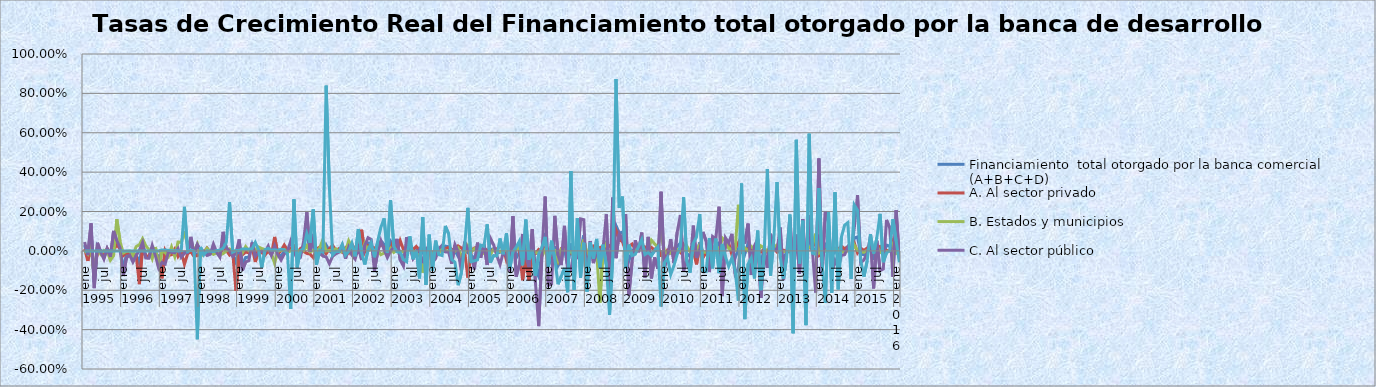
| Category | Financiamiento  total otorgado por la banca comercial (A+B+C+D)  | A. Al sector privado  | B. Estados y municipios  | C. Al sector público  | D. Otros  |
|---|---|---|---|---|---|
| 0 | 0.029 | 0.01 | 0.003 | 0.045 | 0 |
| 1 | -0.033 | -0.051 | -0.016 | -0.022 | 0 |
| 2 | 0.092 | 0.028 | 0.031 | 0.14 | 0 |
| 3 | -0.159 | -0.112 | -0.131 | -0.189 | 0 |
| 4 | 0.024 | -0.002 | 0.022 | 0.041 | 0 |
| 5 | -0.004 | 0.001 | -0.016 | -0.006 | 0 |
| 6 | -0.034 | -0.025 | 0.002 | -0.042 | 0 |
| 7 | 0.011 | 0.013 | -0.002 | 0.011 | 0 |
| 8 | -0.024 | -0.011 | -0.047 | -0.031 | 0 |
| 9 | 0.059 | 0.003 | -0.024 | 0.101 | 0 |
| 10 | 0.05 | 0.032 | 0.162 | 0.053 | 0 |
| 11 | 0.015 | 0.01 | 0.048 | 0.016 | 0 |
| 12 | -0.086 | -0.024 | -0.011 | -0.128 | 0 |
| 13 | -0.024 | -0.01 | -0.002 | -0.035 | 0 |
| 14 | -0.018 | -0.015 | -0.001 | -0.022 | 0 |
| 15 | -0.043 | -0.024 | -0.024 | -0.057 | 0 |
| 16 | -0.02 | -0.02 | 0.022 | -0.024 | 0 |
| 17 | -0.062 | -0.169 | 0.031 | 0.003 | 0 |
| 18 | 0.035 | 0.016 | 0.062 | 0.043 | 0 |
| 19 | -0.03 | -0.028 | 0.026 | -0.037 | 0 |
| 20 | -0.03 | -0.024 | 0.005 | -0.037 | 0 |
| 21 | 0.02 | 0.018 | -0.039 | 0.027 | 0 |
| 22 | -0.017 | -0.007 | 0.019 | -0.026 | 0 |
| 23 | -0.026 | -0.051 | -0.087 | -0.088 | 0 |
| 24 | -0.079 | -0.139 | -0.002 | -0.059 | 0.005 |
| 25 | -0.037 | 0.004 | -0.008 | -0.067 | 0.005 |
| 26 | -0.013 | -0.023 | -0.028 | -0.007 | 0.003 |
| 27 | -0.009 | -0.02 | 0.02 | -0.008 | 0.001 |
| 28 | -0.004 | 0.009 | -0.028 | -0.01 | 0.001 |
| 29 | 0.001 | -0.029 | 0.045 | 0.013 | 0 |
| 30 | -0.017 | -0.005 | 0.044 | -0.032 | 0 |
| 31 | -0.007 | -0.068 | 0.099 | -0.012 | 0.224 |
| 32 | -0.007 | -0.014 | 0.031 | -0.009 | -0.003 |
| 33 | 0.042 | -0.005 | 0.053 | 0.071 | 0.004 |
| 34 | -0.02 | -0.029 | -0.002 | -0.02 | -0.001 |
| 35 | -0.018 | -0.024 | 0.035 | 0.033 | -0.449 |
| 36 | -0.004 | -0.016 | -0.032 | 0.004 | 0.019 |
| 37 | -0.005 | -0.009 | -0.008 | -0.001 | -0.02 |
| 38 | -0.009 | 0.015 | 0.013 | -0.023 | 0 |
| 39 | -0.013 | -0.006 | -0.006 | -0.018 | -0.001 |
| 40 | 0.014 | -0.014 | -0.018 | 0.035 | -0.004 |
| 41 | -0.007 | -0.005 | -0.009 | -0.008 | 0.002 |
| 42 | -0.026 | -0.021 | -0.021 | -0.032 | 0.004 |
| 43 | 0.062 | 0.019 | -0.014 | 0.097 | 0.013 |
| 44 | 0.012 | 0.004 | 0 | 0.015 | 0.043 |
| 45 | 0.006 | -0.022 | 0.01 | 0.001 | 0.248 |
| 46 | -0.02 | -0.01 | 0 | -0.029 | -0.007 |
| 47 | -0.06 | -0.203 | -0.001 | -0.012 | 0.002 |
| 48 | 0.034 | -0.024 | 0.023 | 0.059 | 0.001 |
| 49 | -0.069 | -0.02 | -0.01 | -0.099 | 0.01 |
| 50 | -0.034 | -0.006 | 0.022 | -0.056 | 0.01 |
| 51 | -0.032 | -0.01 | 0.001 | -0.05 | 0.008 |
| 52 | 0.031 | 0.018 | 0.008 | 0.043 | 0.011 |
| 53 | -0.026 | -0.057 | 0.007 | -0.027 | 0.043 |
| 54 | -0.003 | 0.007 | 0.02 | -0.012 | 0.006 |
| 55 | -0.007 | -0.009 | 0.012 | -0.002 | -0.085 |
| 56 | -0.008 | -0.022 | 0.007 | -0.007 | 0.006 |
| 57 | 0.016 | -0.001 | 0.008 | 0.024 | 0.013 |
| 58 | -0.019 | -0.021 | -0.012 | -0.022 | 0.004 |
| 59 | 0.024 | 0.071 | -0.063 | 0.025 | 0.005 |
| 60 | -0.015 | -0.016 | -0.001 | -0.02 | 0.003 |
| 61 | -0.027 | 0.001 | 0.002 | -0.047 | 0.008 |
| 62 | -0.001 | 0.03 | 0.007 | -0.016 | 0.005 |
| 63 | -0.001 | 0.004 | -0.007 | -0.001 | -0.013 |
| 64 | 0.012 | 0.013 | 0 | 0.05 | -0.295 |
| 65 | 0.018 | 0.024 | 0.004 | 0 | 0.262 |
| 66 | -0.033 | -0.01 | 0.005 | -0.043 | -0.084 |
| 67 | -0.018 | 0.011 | -0.007 | -0.034 | 0.001 |
| 68 | 0.027 | -0.003 | 0 | 0.047 | 0.012 |
| 69 | 0.121 | -0.013 | 0.026 | 0.196 | 0.088 |
| 70 | -0.005 | -0.016 | -0.005 | -0.004 | 0.041 |
| 71 | 0.059 | -0.034 | 0.002 | 0.086 | 0.211 |
| 72 | -0.028 | 0.008 | -0.003 | -0.039 | -0.071 |
| 73 | -0.003 | 0.02 | 0.015 | -0.013 | 0.003 |
| 74 | -0.012 | -0.004 | 0.058 | -0.027 | -0.006 |
| 75 | 0.03 | -0.015 | 0 | -0.031 | 0.839 |
| 76 | 0 | 0.011 | 0.002 | -0.064 | 0.324 |
| 77 | -0.012 | 0.029 | 0.003 | -0.028 | -0.021 |
| 78 | -0.007 | 0.002 | 0.011 | -0.015 | -0.002 |
| 79 | -0.002 | 0.012 | -0.003 | -0.007 | -0.003 |
| 80 | 0.019 | -0.006 | -0.005 | 0.029 | 0.033 |
| 81 | -0.022 | 0.015 | -0.005 | -0.04 | -0.022 |
| 82 | 0.013 | -0.009 | 0.052 | 0.018 | -0.001 |
| 83 | 0.004 | 0.035 | 0.019 | -0.022 | 0.039 |
| 84 | -0.026 | 0.004 | -0.006 | -0.042 | -0.027 |
| 85 | 0.025 | -0.006 | 0.015 | 0.015 | 0.111 |
| 86 | -0.003 | 0.107 | -0.008 | -0.047 | -0.009 |
| 87 | 0.005 | -0.006 | 0.039 | 0.028 | -0.069 |
| 88 | 0.041 | 0.027 | 0.004 | 0.067 | 0.004 |
| 89 | 0.04 | 0.016 | 0.007 | 0.058 | 0.042 |
| 90 | -0.054 | 0.016 | -0.002 | -0.101 | -0.032 |
| 91 | 0.007 | 0.011 | 0.003 | -0.006 | 0.048 |
| 92 | 0.051 | 0.034 | -0.019 | 0.052 | 0.12 |
| 93 | 0.033 | 0.017 | -0.011 | 0.007 | 0.165 |
| 94 | -0.014 | 0.017 | -0.005 | -0.034 | -0.009 |
| 95 | 0.05 | 0.001 | 0.014 | -0.001 | 0.258 |
| 96 | 0.027 | 0.059 | -0.008 | 0.019 | 0.024 |
| 97 | 0.024 | -0.006 | 0.003 | 0.061 | -0.005 |
| 98 | -0.011 | 0.052 | -0.005 | -0.047 | -0.007 |
| 99 | -0.042 | 0.006 | -0.005 | -0.077 | -0.044 |
| 100 | 0.022 | 0.018 | 0.003 | 0.07 | -0.055 |
| 101 | 0.034 | 0.031 | 0.015 | 0.021 | 0.074 |
| 102 | -0.025 | 0.005 | -0.004 | -0.04 | -0.042 |
| 103 | 0 | 0.022 | -0.004 | -0.013 | 0.002 |
| 104 | -0.025 | 0.003 | -0.009 | 0.008 | -0.139 |
| 105 | -0.003 | 0.011 | -0.11 | -0.062 | 0.171 |
| 106 | -0.034 | 0.011 | -0.011 | 0.001 | -0.173 |
| 107 | 0.032 | 0.005 | 0.016 | 0.032 | 0.083 |
| 108 | -0.051 | -0.014 | -0.022 | -0.06 | -0.102 |
| 109 | -0.006 | 0.006 | -0.015 | -0.038 | 0.052 |
| 110 | 0.004 | 0.011 | -0.012 | 0.012 | -0.019 |
| 111 | 0.009 | 0.001 | 0.016 | 0.028 | -0.024 |
| 112 | 0.024 | 0.01 | 0.002 | -0.005 | 0.127 |
| 113 | 0.021 | 0.018 | -0.003 | -0.005 | 0.088 |
| 114 | -0.033 | 0.009 | 0 | -0.065 | -0.044 |
| 115 | 0 | 0 | -0.002 | 0.032 | -0.057 |
| 116 | -0.027 | 0.025 | 0.014 | -0.004 | -0.174 |
| 117 | -0.059 | 0.015 | -0.026 | -0.105 | -0.111 |
| 118 | 0.021 | -0.001 | -0.008 | 0.046 | 0.023 |
| 119 | -0.009 | -0.136 | 0.026 | 0.005 | 0.219 |
| 120 | -0.02 | 0.004 | -0.005 | -0.024 | -0.055 |
| 121 | -0.042 | 0.014 | 0.011 | -0.094 | -0.051 |
| 122 | 0.014 | 0.019 | -0.002 | 0.042 | -0.045 |
| 123 | -0.008 | 0.002 | -0.002 | -0.034 | 0.029 |
| 124 | 0.02 | 0.012 | -0.013 | 0.034 | 0.024 |
| 125 | -0.002 | 0.003 | -0.006 | -0.072 | 0.135 |
| 126 | 0.007 | -0.003 | -0.02 | 0.064 | -0.06 |
| 127 | 0.01 | 0.007 | 0.009 | 0.031 | -0.024 |
| 128 | -0.011 | 0.01 | -0.003 | -0.024 | -0.025 |
| 129 | -0.007 | 0.022 | -0.001 | -0.07 | 0.063 |
| 130 | -0.001 | 0.017 | -0.01 | -0.008 | -0.017 |
| 131 | -0.007 | -0.049 | 0.024 | -0.026 | 0.089 |
| 132 | -0.063 | -0.018 | -0.001 | -0.105 | -0.092 |
| 133 | 0.064 | 0.02 | -0.006 | 0.177 | -0.004 |
| 134 | -0.037 | 0.021 | 0.006 | -0.132 | 0.018 |
| 135 | -0.007 | 0.011 | 0.016 | -0.07 | 0.05 |
| 136 | -0.045 | -0.149 | 0.004 | 0.086 | -0.073 |
| 137 | 0.015 | -0.034 | 0.024 | -0.029 | 0.159 |
| 138 | -0.087 | -0.149 | -0.013 | -0.083 | -0.046 |
| 139 | 0.033 | -0.017 | -0.002 | 0.11 | 0.005 |
| 140 | -0.096 | -0.014 | -0.01 | -0.164 | -0.127 |
| 141 | -0.13 | 0.008 | -0.009 | -0.382 | -0.015 |
| 142 | -0.003 | -0.002 | -0.028 | -0.015 | 0.018 |
| 143 | 0.091 | 0.017 | 0.007 | 0.276 | 0.071 |
| 144 | -0.074 | -0.017 | 0.01 | -0.175 | -0.082 |
| 145 | -0.039 | -0.032 | 0 | -0.168 | 0.052 |
| 146 | 0.023 | -0.009 | 0.002 | 0.178 | -0.04 |
| 147 | -0.076 | -0.05 | -0.049 | -0.022 | -0.169 |
| 148 | -0.045 | 0.012 | 0.008 | -0.072 | -0.129 |
| 149 | 0.021 | 0.019 | 0.006 | 0.127 | -0.086 |
| 150 | -0.074 | -0.009 | -0.006 | -0.099 | -0.21 |
| 151 | 0.037 | -0.015 | -0.005 | -0.096 | 0.405 |
| 152 | -0.045 | 0.01 | -0.023 | 0.002 | -0.198 |
| 153 | 0.03 | 0.027 | -0.016 | -0.042 | 0.167 |
| 154 | 0.005 | -0.003 | -0.003 | 0.162 | -0.137 |
| 155 | 0.079 | 0.051 | 0.059 | 0.158 | 0.041 |
| 156 | -0.106 | -0.03 | -0.017 | -0.188 | -0.207 |
| 157 | 0.017 | -0.002 | -0.012 | 0.05 | 0.043 |
| 158 | -0.016 | 0.022 | -0.011 | -0.062 | -0.04 |
| 159 | 0.009 | 0 | -0.003 | -0.001 | 0.061 |
| 160 | -0.047 | 0.017 | -0.263 | 0.005 | -0.085 |
| 161 | 0.02 | 0.022 | 0.011 | 0.013 | 0.031 |
| 162 | 0.045 | 0.007 | 0.04 | 0.186 | -0.073 |
| 163 | -0.11 | 0.026 | -0.026 | -0.234 | -0.326 |
| 164 | 0.084 | 0.036 | -0.003 | 0.271 | -0.034 |
| 165 | 0.129 | 0.104 | 0.027 | -0.037 | 0.873 |
| 166 | 0.091 | 0.055 | 0.067 | 0.086 | 0.219 |
| 167 | 0.095 | 0.049 | 0.075 | 0.054 | 0.276 |
| 168 | 0.027 | -0.002 | 0.007 | 0.187 | -0.088 |
| 169 | -0.05 | 0.02 | -0.002 | -0.226 | 0.031 |
| 170 | -0.003 | 0.035 | -0.011 | -0.053 | -0.023 |
| 171 | 0.013 | 0.01 | -0.001 | 0.054 | -0.017 |
| 172 | 0.01 | 0.011 | 0.026 | -0.007 | 0.021 |
| 173 | 0.045 | 0.024 | 0.014 | 0.093 | 0.058 |
| 174 | -0.026 | 0.02 | 0.002 | -0.136 | -0.018 |
| 175 | 0.016 | 0.004 | 0.007 | 0.071 | -0.008 |
| 176 | -0.022 | 0.017 | 0.054 | -0.14 | -0.025 |
| 177 | 0 | 0.004 | 0.036 | -0.034 | 0.003 |
| 178 | 0.002 | 0.026 | 0.019 | -0.091 | 0.02 |
| 179 | -0.006 | -0.024 | 0.103 | 0.301 | -0.282 |
| 180 | -0.041 | -0.024 | -0.002 | -0.088 | -0.062 |
| 181 | -0.011 | 0.004 | -0.017 | -0.027 | -0.034 |
| 182 | -0.01 | -0.008 | -0.011 | 0.059 | -0.12 |
| 183 | -0.017 | 0.011 | 0.004 | -0.062 | -0.075 |
| 184 | 0.023 | 0.008 | 0.007 | 0.095 | -0.018 |
| 185 | 0.04 | -0.008 | -0.001 | 0.182 | 0.023 |
| 186 | 0.021 | 0.032 | 0.008 | -0.1 | 0.272 |
| 187 | -0.012 | 0.004 | 0.025 | -0.044 | -0.054 |
| 188 | -0.029 | 0.004 | -0.004 | -0.074 | -0.111 |
| 189 | 0.031 | -0.003 | 0.004 | 0.128 | 0.037 |
| 190 | -0.035 | -0.069 | -0.001 | -0.036 | 0.07 |
| 191 | 0.042 | 0.024 | 0.031 | 0.004 | 0.187 |
| 192 | -0.012 | -0.035 | -0.006 | 0.096 | -0.103 |
| 193 | -0.008 | -0.009 | -0.007 | 0.049 | -0.105 |
| 194 | -0.019 | 0.002 | 0 | -0.107 | 0.064 |
| 195 | 0.002 | -0.002 | -0.013 | 0.073 | -0.089 |
| 196 | 0.029 | 0.001 | 0.035 | 0.062 | 0.062 |
| 197 | 0.041 | -0.006 | -0.007 | 0.224 | -0.113 |
| 198 | -0.048 | 0.023 | 0.066 | -0.229 | 0.035 |
| 199 | 0.031 | 0.022 | 0.05 | 0.066 | -0.03 |
| 200 | 0.023 | 0.041 | 0.012 | 0.04 | -0.079 |
| 201 | 0.011 | -0.021 | 0.008 | 0.087 | -0.035 |
| 202 | -0.036 | 0.012 | 0.006 | -0.117 | -0.1 |
| 203 | 0.011 | 0.043 | 0.234 | -0.092 | -0.252 |
| 204 | 0.046 | -0.007 | 0.025 | 0.094 | 0.342 |
| 205 | -0.016 | 0.003 | 0.015 | 0.037 | -0.347 |
| 206 | 0.037 | 0.011 | 0.001 | 0.138 | -0.067 |
| 207 | -0.028 | 0.008 | 0.023 | -0.122 | -0.036 |
| 208 | 0.012 | 0.024 | 0.006 | 0.025 | -0.14 |
| 209 | 0.017 | -0.004 | -0.004 | 0.061 | 0.103 |
| 210 | -0.072 | -0.006 | 0.025 | -0.239 | -0.199 |
| 211 | 0.009 | 0.009 | 0.015 | 0.008 | -0.02 |
| 212 | -0.006 | -0.005 | -0.005 | -0.086 | 0.416 |
| 213 | 0.017 | 0.001 | 0.027 | 0.087 | -0.126 |
| 214 | 0.019 | 0.017 | 0.019 | 0.013 | 0.059 |
| 215 | 0.02 | -0.006 | 0.03 | 0.001 | 0.35 |
| 216 | 0.022 | -0.003 | 0.004 | 0.119 | -0.028 |
| 217 | -0.042 | 0.003 | -0.004 | -0.148 | -0.141 |
| 218 | -0.007 | -0.003 | -0.003 | -0.011 | -0.034 |
| 219 | 0.043 | -0.006 | 0.005 | 0.171 | 0.185 |
| 220 | -0.038 | 0.022 | 0.004 | -0.106 | -0.418 |
| 221 | 0.051 | 0.016 | 0.019 | 0.083 | 0.564 |
| 222 | -0.031 | -0.004 | -0.002 | -0.115 | -0.064 |
| 223 | 0.054 | 0.023 | 0.009 | 0.162 | 0.153 |
| 224 | -0.041 | 0.013 | 0.008 | -0.121 | -0.377 |
| 225 | 0.072 | 0.015 | 0.017 | 0.182 | 0.595 |
| 226 | 0.011 | 0.011 | 0.028 | -0.001 | -0.012 |
| 227 | 0.002 | 0.06 | 0.087 | -0.211 | -0.017 |
| 228 | 0.082 | -0.025 | -0.011 | 0.469 | 0.319 |
| 229 | -0.043 | -0.019 | -0.002 | -0.125 | -0.057 |
| 230 | 0.028 | 0.006 | -0.001 | 0.198 | -0.264 |
| 231 | 0.052 | 0.014 | -0.004 | 0.148 | 0.197 |
| 232 | -0.035 | 0.007 | 0.009 | -0.107 | -0.212 |
| 233 | 0.007 | 0.009 | 0.012 | -0.049 | 0.298 |
| 234 | -0.027 | 0.008 | 0.005 | -0.088 | -0.195 |
| 235 | 0.009 | 0.024 | -0.004 | -0.023 | 0.07 |
| 236 | 0.006 | 0.011 | -0.007 | -0.019 | 0.131 |
| 237 | 0.022 | 0.02 | 0 | 0.019 | 0.143 |
| 238 | -0.004 | 0.013 | -0.008 | -0.003 | -0.142 |
| 239 | 0.065 | 0.041 | 0.03 | 0.118 | 0.233 |
| 240 | 0.071 | -0.01 | 0.003 | 0.284 | 0.207 |
| 241 | -0.014 | 0.014 | -0.005 | -0.061 | -0.049 |
| 242 | -0.02 | 0.002 | -0.007 | -0.045 | -0.131 |
| 243 | 0.001 | 0.015 | 0.003 | -0.014 | -0.05 |
| 244 | 0.032 | 0.017 | 0.003 | 0.073 | 0.085 |
| 245 | -0.046 | 0.009 | -0.008 | -0.19 | -0.013 |
| 246 | 0.029 | 0.016 | 0.026 | 0.052 | 0.066 |
| 247 | 0 | 0.023 | -0.006 | -0.101 | 0.188 |
| 248 | -0.022 | 0.005 | -0.011 | -0.093 | -0.058 |
| 249 | 0.029 | 0.003 | -0.003 | 0.157 | -0.01 |
| 250 | 0.024 | 0 | -0.001 | 0.116 | 0.001 |
| 251 | 0.015 | 0.052 | 0.033 | -0.132 | 0.161 |
| 252 | 0.044 | 0.005 | -0.014 | 0.207 | 0.05 |
| 253 | -0.022 | -0.014 | -0.008 | -0.039 | -0.058 |